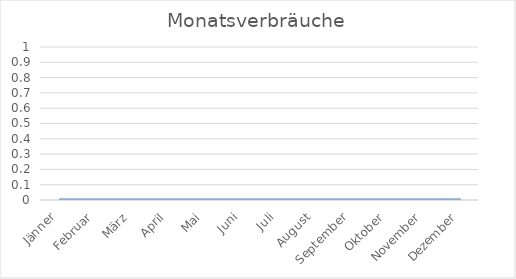
| Category | Series 0 |
|---|---|
| Jänner | 0 |
| Februar | 0 |
| März | 0 |
| April | 0 |
| Mai | 0 |
| Juni | 0 |
| Juli | 0 |
| August | 0 |
| September | 0 |
| Oktober | 0 |
| November | 0 |
| Dezember | 0 |